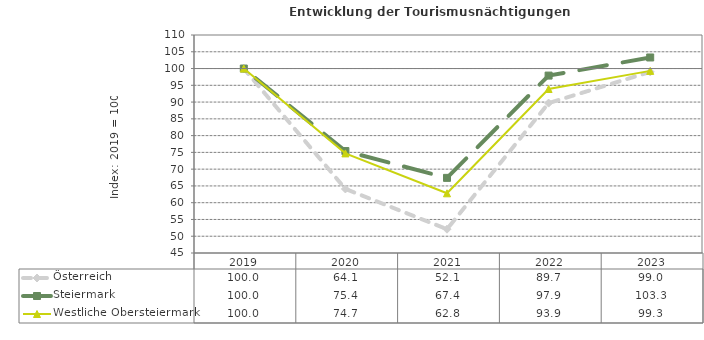
| Category | Österreich | Steiermark | Westliche Obersteiermark |
|---|---|---|---|
| 2023.0 | 99 | 103.3 | 99.3 |
| 2022.0 | 89.7 | 97.9 | 93.9 |
| 2021.0 | 52.1 | 67.4 | 62.8 |
| 2020.0 | 64.1 | 75.4 | 74.7 |
| 2019.0 | 100 | 100 | 100 |